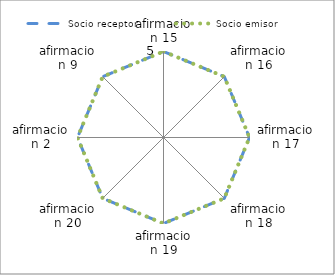
| Category | Socio receptor  | Socio emisor |
|---|---|---|
| afirmacion 15 | 5 | 5 |
| afirmacion 16 | 5 | 5 |
| afirmacion 17 | 5 | 5 |
| afirmacion 18 | 5 | 5 |
| afirmacion 19 | 5 | 5 |
| afirmacion 20 | 5 | 5 |
| afirmacion 2 | 5 | 5 |
| afirmacion 9 | 5 | 5 |